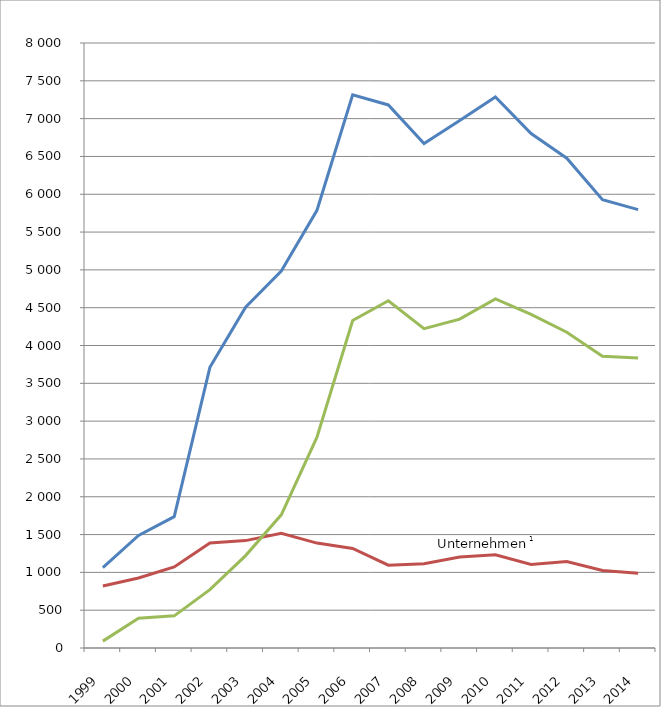
| Category | Verfahren
Insgesamt | von Unternehmen1 | von Verbrauchern |
|---|---|---|---|
| 1999.0 | 1064 | 820 | 91 |
| 2000.0 | 1488 | 926 | 394 |
| 2001.0 | 1737 | 1072 | 425 |
| 2002.0 | 3712 | 1388 | 772 |
| 2003.0 | 4507 | 1420 | 1222 |
| 2004.0 | 4984 | 1516 | 1761 |
| 2005.0 | 5788 | 1387 | 2788 |
| 2006.0 | 7315 | 1317 | 4330 |
| 2007.0 | 7181 | 1095 | 4592 |
| 2008.0 | 6671 | 1114 | 4223 |
| 2009.0 | 6976 | 1203 | 4349 |
| 2010.0 | 7287 | 1233 | 4615 |
| 2011.0 | 6803 | 1104 | 4412 |
| 2012.0 | 6477 | 1143 | 4175 |
| 2013.0 | 5928 | 1026 | 3858 |
| 2014.0 | 5796 | 987 | 3835 |